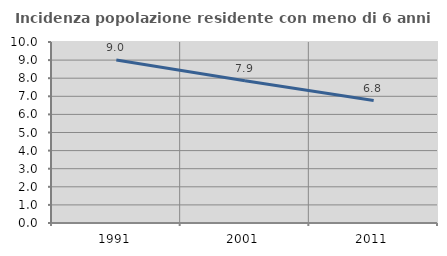
| Category | Incidenza popolazione residente con meno di 6 anni |
|---|---|
| 1991.0 | 9.011 |
| 2001.0 | 7.863 |
| 2011.0 | 6.763 |